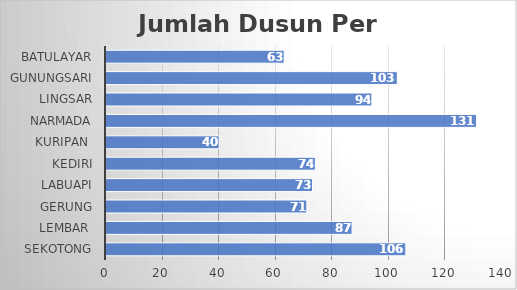
| Category | Series 0 |
|---|---|
| Sekotong | 106 |
| Lembar  | 87 |
| Gerung | 71 |
| Labuapi | 73 |
| Kediri | 74 |
| Kuripan  | 40 |
| Narmada | 131 |
| Lingsar | 94 |
| Gunungsari | 103 |
| Batulayar | 63 |